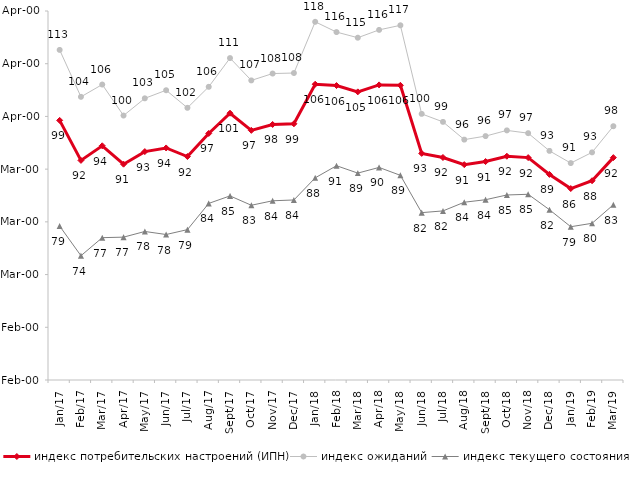
| Category | индекс потребительских настроений (ИПН) | Series 0 | индекс ожиданий | Series 3 | индекс текущего состояния |
|---|---|---|---|---|---|
| 2017-01-01 | 99.25 | 2017-01-01 | 112.617 | 2017-01-01 | 79.2 |
| 2017-02-01 | 91.66 | 2017-02-01 | 103.717 | 2017-02-01 | 73.575 |
| 2017-03-01 | 94.43 | 2017-03-01 | 106.05 | 2017-03-01 | 77 |
| 2017-04-01 | 90.94 | 2017-04-01 | 100.167 | 2017-04-01 | 77.1 |
| 2017-05-01 | 93.33 | 2017-05-01 | 103.433 | 2017-05-01 | 78.175 |
| 2017-06-01 | 94.02 | 2017-06-01 | 104.967 | 2017-06-01 | 77.6 |
| 2017-07-01 | 92.39 | 2017-07-01 | 101.633 | 2017-07-01 | 78.525 |
| 2017-08-01 | 96.77 | 2017-08-01 | 105.617 | 2017-08-01 | 83.5 |
| 2017-09-01 | 100.61 | 2017-09-01 | 111.067 | 2017-09-01 | 84.925 |
| 2017-10-01 | 97.36 | 2017-10-01 | 106.833 | 2017-10-01 | 83.15 |
| 2017-11-01 | 98.48 | 2017-11-01 | 108.133 | 2017-11-01 | 84 |
| 2017-12-01 | 98.6 | 2017-12-01 | 108.233 | 2017-12-01 | 84.15 |
| 2018-01-01 | 106.11 | 2018-01-01 | 117.95 | 2018-01-01 | 88.35 |
| 2018-02-01 | 105.86 | 2018-02-01 | 116 | 2018-02-01 | 90.65 |
| 2018-03-01 | 104.66 | 2018-03-01 | 114.933 | 2018-03-01 | 89.25 |
| 2018-04-01 | 105.98 | 2018-04-01 | 116.417 | 2018-04-01 | 90.325 |
| 2018-05-01 | 105.9 | 2018-05-01 | 117.283 | 2018-05-01 | 88.825 |
| 2018-06-01 | 92.99 | 2018-06-01 | 100.483 | 2018-06-01 | 81.75 |
| 2018-07-01 | 92.21 | 2018-07-01 | 98.967 | 2018-07-01 | 82.075 |
| 2018-08-01 | 90.85 | 2018-08-01 | 95.6 | 2018-08-01 | 83.725 |
| 2018-09-01 | 91.44 | 2018-09-01 | 96.267 | 2018-09-01 | 84.2 |
| 2018-10-01 | 92.45 | 2018-10-01 | 97.35 | 2018-10-01 | 85.1 |
| 2018-11-01 | 92.186 | 2018-11-01 | 96.823 | 2018-11-01 | 85.23 |
| 2018-12-01 | 89 | 2018-12-01 | 93.467 | 2018-12-01 | 82.3 |
| 2019-01-01 | 86.32 | 2019-01-01 | 91.15 | 2019-01-01 | 79.075 |
| 2019-02-01 | 87.8 | 2019-02-01 | 93.183 | 2019-02-01 | 79.725 |
| 2019-03-01 | 92.183 | 2019-03-01 | 98.144 | 2019-03-01 | 83.242 |